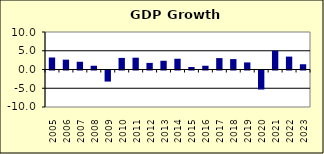
| Category | 1.8 |
|---|---|
| 2005.0 | 3.201 |
| 2006.0 | 2.623 |
| 2007.0 | 2.063 |
| 2008.0 | 1 |
| 2009.0 | -2.95 |
| 2010.0 | 3.09 |
| 2011.0 | 3.146 |
| 2012.0 | 1.761 |
| 2013.0 | 2.329 |
| 2014.0 | 2.87 |
| 2015.0 | 0.659 |
| 2016.0 | 1.001 |
| 2017.0 | 3.04 |
| 2018.0 | 2.777 |
| 2019.0 | 1.888 |
| 2020.0 | -5.074 |
| 2021.0 | 5.012 |
| 2022.0 | 3.438 |
| 2023.0 | 1.4 |